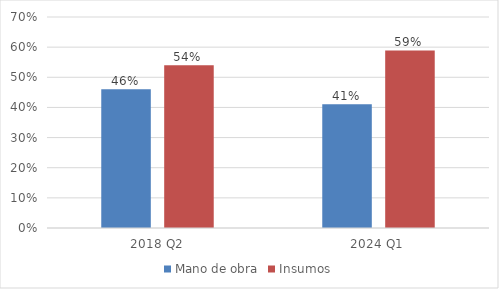
| Category | Mano de obra | Insumos |
|---|---|---|
| 2018 Q2 | 0.46 | 0.54 |
| 2024 Q1 | 0.411 | 0.589 |